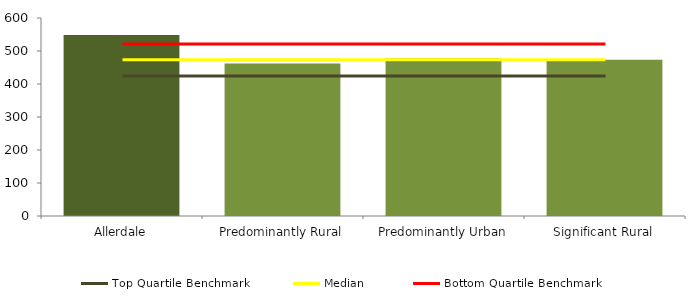
| Category | Series 0 |
|---|---|
| Allerdale | 548.6 |
| Predominantly Rural | 462.085 |
| Predominantly Urban | 477.41 |
| Significant Rural | 473.621 |